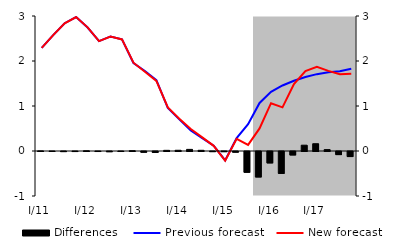
| Category | Differences |
|---|---|
| 0 | 0.002 |
| 1 | 0 |
| 2 | -0.002 |
| 3 | -0.001 |
| 4 | 0.005 |
| 5 | -0.001 |
| 6 | -0.004 |
| 7 | -0.001 |
| 8 | 0.007 |
| 9 | -0.016 |
| 10 | -0.021 |
| 11 | 0.015 |
| 12 | 0.016 |
| 13 | 0.036 |
| 14 | 0.015 |
| 15 | -0.003 |
| 16 | -0.004 |
| 17 | -0.015 |
| 18 | -0.462 |
| 19 | -0.566 |
| 20 | -0.253 |
| 21 | -0.487 |
| 22 | -0.077 |
| 23 | 0.129 |
| 24 | 0.162 |
| 25 | 0.031 |
| 26 | -0.069 |
| 27 | -0.112 |